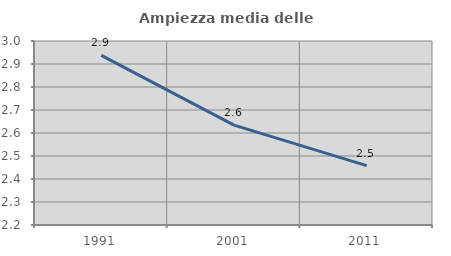
| Category | Ampiezza media delle famiglie |
|---|---|
| 1991.0 | 2.937 |
| 2001.0 | 2.634 |
| 2011.0 | 2.458 |